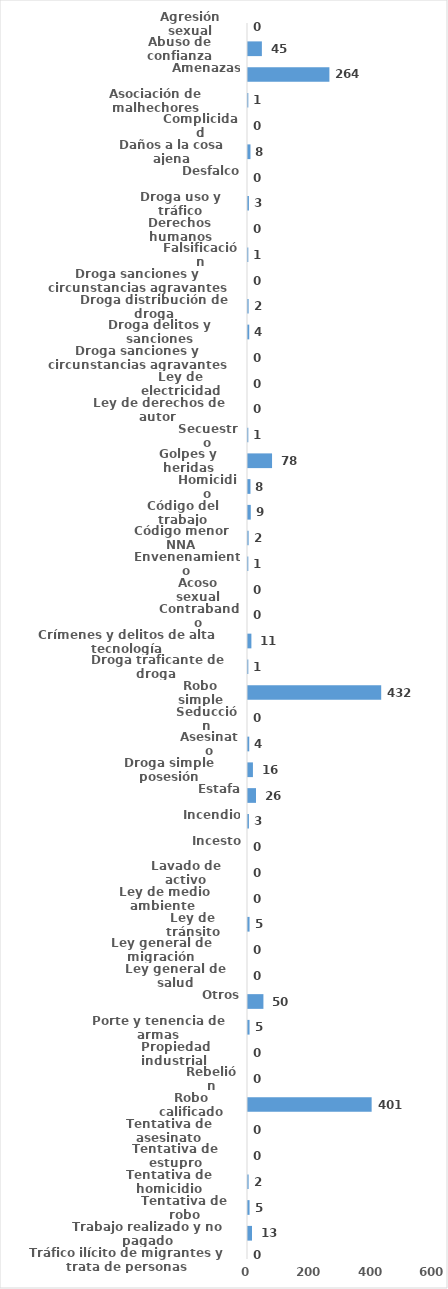
| Category | Series 0 |
|---|---|
| Agresión sexual | 0 |
| Abuso de confianza | 45 |
| Amenazas | 264 |
| Asociación de malhechores | 1 |
| Complicidad | 0 |
| Daños a la cosa ajena | 8 |
| Desfalco | 0 |
| Droga uso y tráfico | 3 |
| Derechos humanos | 0 |
| Falsificación | 1 |
| Droga sanciones y circunstancias agravantes | 0 |
| Droga distribución de droga | 2 |
| Droga delitos y sanciones | 4 |
| Droga sanciones y circunstancias agravantes | 0 |
| Ley de electricidad | 0 |
| Ley de derechos de autor  | 0 |
| Secuestro | 1 |
| Golpes y heridas | 78 |
| Homicidio | 8 |
| Código del trabajo | 9 |
| Código menor NNA | 2 |
| Envenenamiento | 1 |
| Acoso sexual | 0 |
| Contrabando | 0 |
| Crímenes y delitos de alta tecnología | 11 |
| Droga traficante de droga  | 1 |
| Robo simple | 432 |
| Seducción | 0 |
| Asesinato | 4 |
| Droga simple posesión | 16 |
| Estafa | 26 |
| Incendio | 3 |
| Incesto | 0 |
| Lavado de activo | 0 |
| Ley de medio ambiente  | 0 |
| Ley de tránsito | 5 |
| Ley general de migración | 0 |
| Ley general de salud | 0 |
| Otros | 50 |
| Porte y tenencia de armas | 5 |
| Propiedad industrial  | 0 |
| Rebelión | 0 |
| Robo calificado | 401 |
| Tentativa de asesinato | 0 |
| Tentativa de estupro | 0 |
| Tentativa de homicidio | 2 |
| Tentativa de robo | 5 |
| Trabajo realizado y no pagado | 13 |
| Tráfico ilícito de migrantes y trata de personas | 0 |